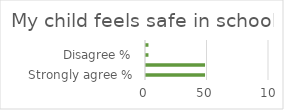
| Category | Series 1 |
|---|---|
| Strongly agree % | 48 |
| Agree % | 48 |
| Disagree % | 2 |
| Strongly disagree % | 2 |